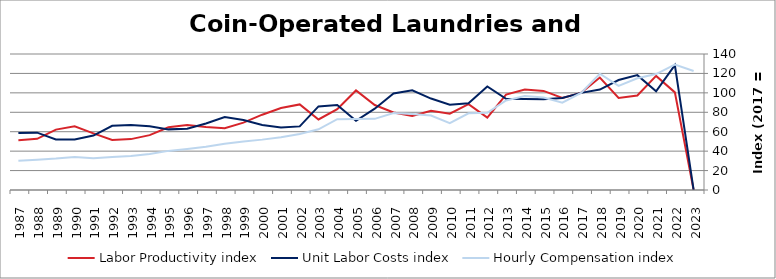
| Category | Labor Productivity index | Unit Labor Costs index | Hourly Compensation index |
|---|---|---|---|
| 2023.0 | 0 | 0 | 122.551 |
| 2022.0 | 100.487 | 128.5 | 129.126 |
| 2021.0 | 117.445 | 101.621 | 119.349 |
| 2020.0 | 97.267 | 118.254 | 115.022 |
| 2019.0 | 94.661 | 113.222 | 107.178 |
| 2018.0 | 115.791 | 103.414 | 119.744 |
| 2017.0 | 100 | 100 | 100 |
| 2016.0 | 94.837 | 94.729 | 89.838 |
| 2015.0 | 102.007 | 93.37 | 95.244 |
| 2014.0 | 103.421 | 93.635 | 96.839 |
| 2013.0 | 98.237 | 93.877 | 92.222 |
| 2012.0 | 74.499 | 106.646 | 79.45 |
| 2011.0 | 88.384 | 89.376 | 78.995 |
| 2010.0 | 78.573 | 87.706 | 68.914 |
| 2009.0 | 81.513 | 94.128 | 76.726 |
| 2008.0 | 76.165 | 102.629 | 78.168 |
| 2007.0 | 79.861 | 99.302 | 79.304 |
| 2006.0 | 87.456 | 83.726 | 73.223 |
| 2005.0 | 102.502 | 71.299 | 73.082 |
| 2004.0 | 83.252 | 87.531 | 72.872 |
| 2003.0 | 72.634 | 86.079 | 62.523 |
| 2002.0 | 88.124 | 65.493 | 57.715 |
| 2001.0 | 84.471 | 64.298 | 54.314 |
| 2000.0 | 77.512 | 66.905 | 51.859 |
| 1999.0 | 69.361 | 72.142 | 50.038 |
| 1998.0 | 63.598 | 75.021 | 47.712 |
| 1997.0 | 64.921 | 68.432 | 44.427 |
| 1996.0 | 66.993 | 63.13 | 42.293 |
| 1995.0 | 64.514 | 62.41 | 40.263 |
| 1994.0 | 56.468 | 65.513 | 36.994 |
| 1993.0 | 52.387 | 67.008 | 35.104 |
| 1992.0 | 51.464 | 66.06 | 33.997 |
| 1991.0 | 58.271 | 56.027 | 32.647 |
| 1990.0 | 65.503 | 51.917 | 34.007 |
| 1989.0 | 62.143 | 52.061 | 32.352 |
| 1988.0 | 52.723 | 59.046 | 31.131 |
| 1987.0 | 51.202 | 58.646 | 30.028 |